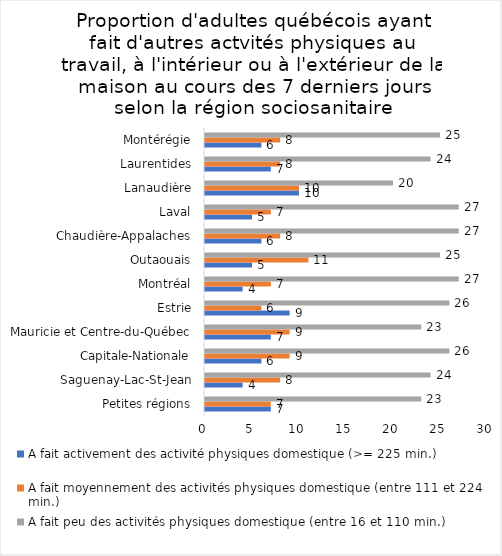
| Category | A fait activement des activité physiques domestique (>= 225 min.) | A fait moyennement des activités physiques domestique (entre 111 et 224 min.) | A fait peu des activités physiques domestique (entre 16 et 110 min.) |
|---|---|---|---|
| Petites régions | 7 | 7 | 23 |
| Saguenay-Lac-St-Jean | 4 | 8 | 24 |
| Capitale-Nationale | 6 | 9 | 26 |
| Mauricie et Centre-du-Québec | 7 | 9 | 23 |
| Estrie | 9 | 6 | 26 |
| Montréal | 4 | 7 | 27 |
| Outaouais | 5 | 11 | 25 |
| Chaudière-Appalaches | 6 | 8 | 27 |
| Laval | 5 | 7 | 27 |
| Lanaudière | 10 | 10 | 20 |
| Laurentides | 7 | 8 | 24 |
| Montérégie | 6 | 8 | 25 |